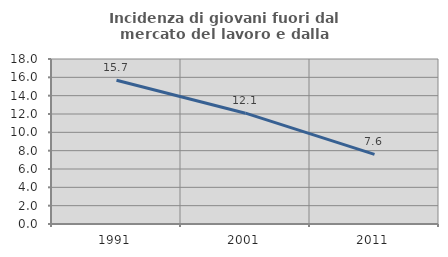
| Category | Incidenza di giovani fuori dal mercato del lavoro e dalla formazione  |
|---|---|
| 1991.0 | 15.676 |
| 2001.0 | 12.088 |
| 2011.0 | 7.595 |